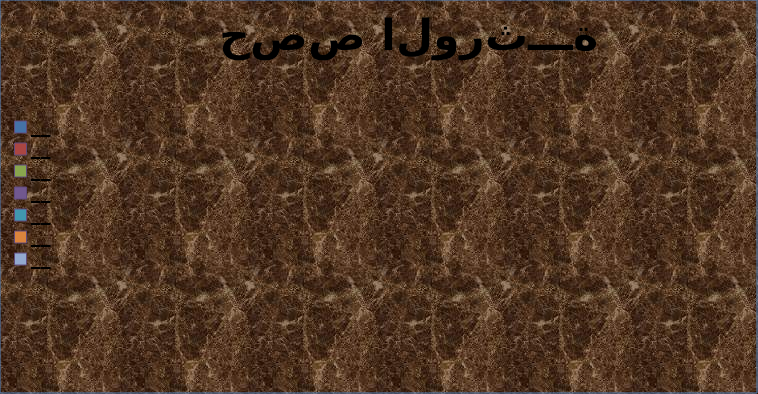
| Category |  حصص الورثـــــــــــــــــــــــــة | __ __ __ __ __ __ __ |
|---|---|---|
| __ | 0 | 0 |
| __ | 0 | 0 |
| __ | 0 | 0 |
| __ | 0 | 0 |
| __ | 0 | 0 |
| __ | 0 | 0 |
| __ | 0 | 0 |